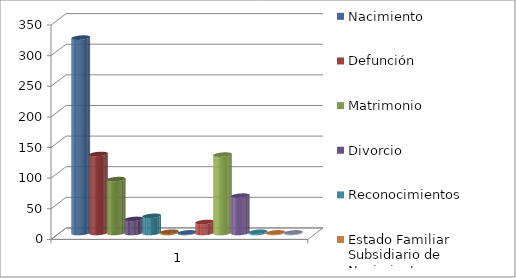
| Category | Nacimiento | Defunción | Matrimonio | Divorcio | Reconocimientos | Estado Familiar Subsidiario de Nacimiento | Unión No Matrimonial | Acta de Matrimonio | Carnet de Identidad Personal | Reposicion de Partida de Nacimiento | Adopción | Nuevo Asentamiento por Cambio de Nombre | Nacido Muerto |
|---|---|---|---|---|---|---|---|---|---|---|---|---|---|
| 0 | 319 | 129 | 88 | 23 | 28 | 2 | 1 | 18 | 128 | 61 | 2 | 1 | 1 |